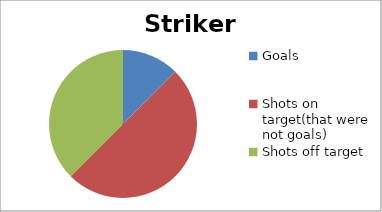
| Category | Striker 4 |
|---|---|
| Goals | 10 |
| Shots on target(that were not goals) | 40 |
| Shots off target | 30 |